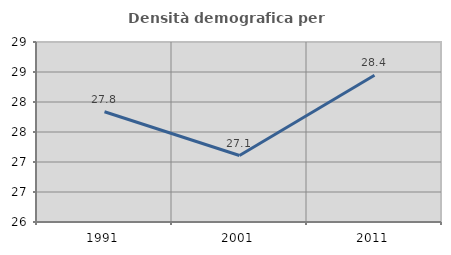
| Category | Densità demografica |
|---|---|
| 1991.0 | 27.837 |
| 2001.0 | 27.108 |
| 2011.0 | 28.445 |